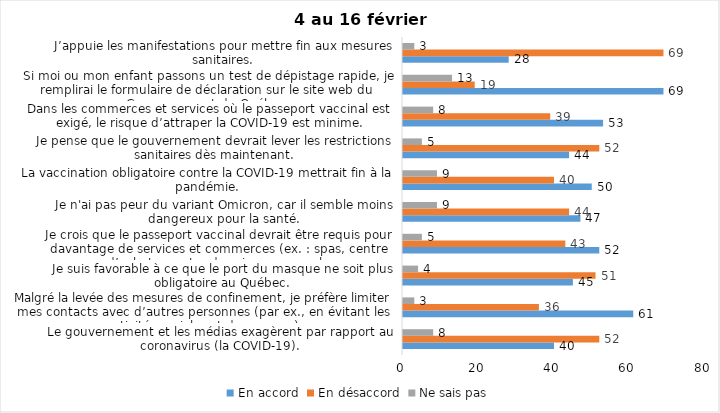
| Category | En accord | En désaccord | Ne sais pas |
|---|---|---|---|
| Le gouvernement et les médias exagèrent par rapport au coronavirus (la COVID-19). | 40 | 52 | 8 |
| Malgré la levée des mesures de confinement, je préfère limiter mes contacts avec d’autres personnes (par ex., en évitant les activités sociales et de groupes) | 61 | 36 | 3 |
| Je suis favorable à ce que le port du masque ne soit plus obligatoire au Québec. | 45 | 51 | 4 |
| Je crois que le passeport vaccinal devrait être requis pour davantage de services et commerces (ex. : spas, centre d’achats, centre de soins personnels. | 52 | 43 | 5 |
| Je n'ai pas peur du variant Omicron, car il semble moins dangereux pour la santé. | 47 | 44 | 9 |
| La vaccination obligatoire contre la COVID-19 mettrait fin à la pandémie. | 50 | 40 | 9 |
| Je pense que le gouvernement devrait lever les restrictions sanitaires dès maintenant. | 44 | 52 | 5 |
| Dans les commerces et services où le passeport vaccinal est exigé, le risque d’attraper la COVID-19 est minime. | 53 | 39 | 8 |
| Si moi ou mon enfant passons un test de dépistage rapide, je remplirai le formulaire de déclaration sur le site web du Gouvernement du Québec. | 69 | 19 | 13 |
| J’appuie les manifestations pour mettre fin aux mesures sanitaires. | 28 | 69 | 3 |